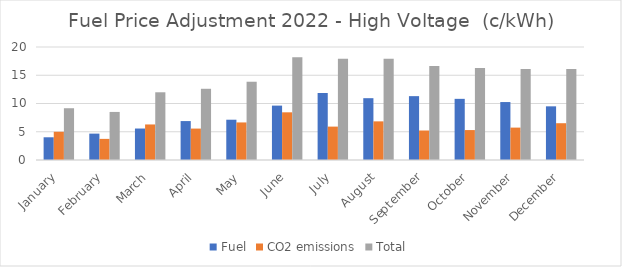
| Category | Fuel | CO2 emissions | Total |
|---|---|---|---|
| January | 4.02 | 4.996 | 9.163 |
| February | 4.67 | 3.738 | 8.506 |
| March | 5.571 | 6.291 | 11.986 |
| April | 6.89 | 5.562 | 12.606 |
| May | 7.13 | 6.649 | 13.852 |
| June | 9.626 | 8.44 | 18.192 |
| July | 11.861 | 5.91 | 17.936 |
| August | 10.941 | 6.838 | 17.904 |
| September | 11.303 | 5.221 | 16.658 |
| October | 10.824 | 5.298 | 16.264 |
| November | 10.257 | 5.733 | 16.114 |
| December | 9.498 | 6.51 | 16.126 |